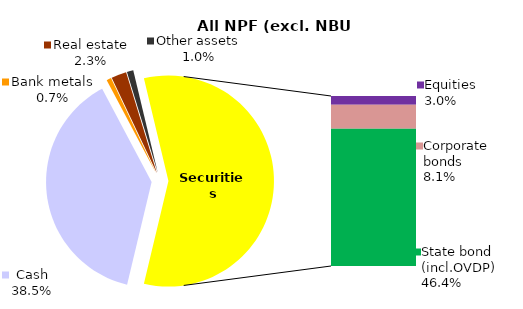
| Category | All NPF (without NBU CNPF) |
|---|---|
| Cash | 525.169 |
| Bank metals | 9.809 |
| Real estate | 31.721 |
| Other assets | 13.441 |
| Equities | 40.296 |
| Corporate bonds | 110.564 |
| Municipal bonds | 0 |
| State bond (incl.OVDP) | 633.138 |